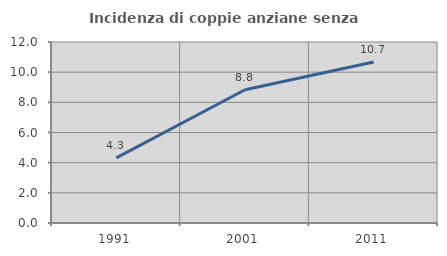
| Category | Incidenza di coppie anziane senza figli  |
|---|---|
| 1991.0 | 4.315 |
| 2001.0 | 8.837 |
| 2011.0 | 10.669 |